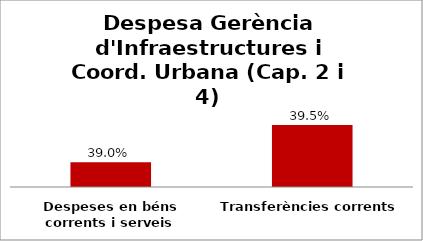
| Category | Series 0 |
|---|---|
| Despeses en béns corrents i serveis | 0.39 |
| Transferències corrents | 0.395 |